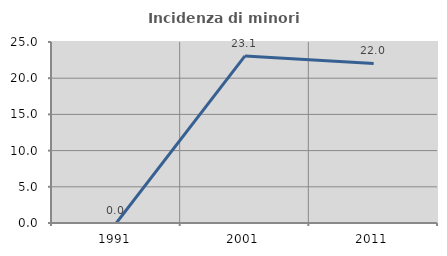
| Category | Incidenza di minori stranieri |
|---|---|
| 1991.0 | 0 |
| 2001.0 | 23.077 |
| 2011.0 | 22.034 |